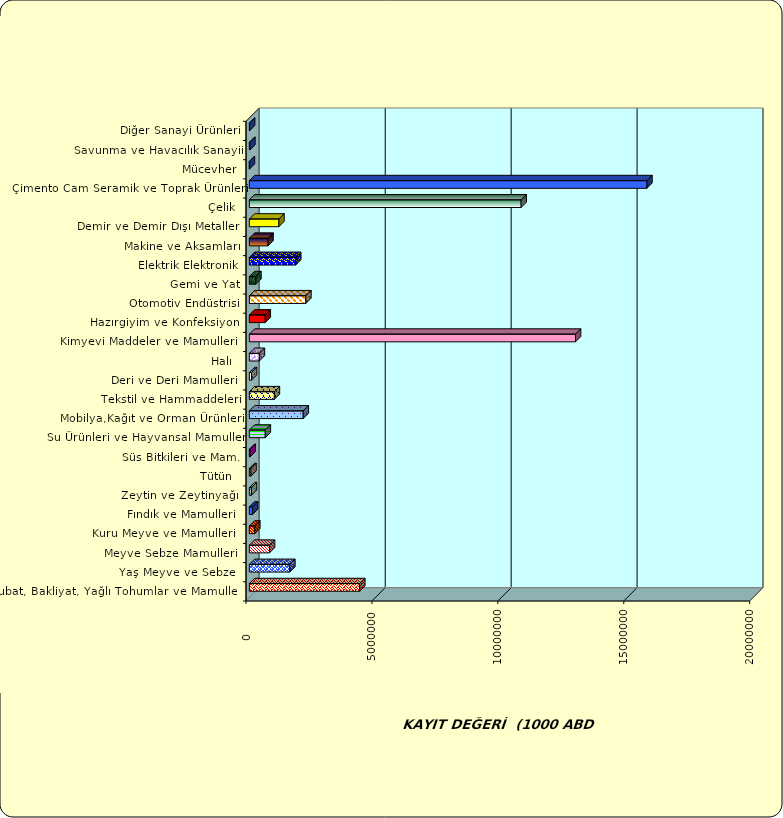
| Category | Series 0 |
|---|---|
|  Hububat, Bakliyat, Yağlı Tohumlar ve Mamulleri  | 4384518.437 |
|  Yaş Meyve ve Sebze   | 1606949.834 |
|  Meyve Sebze Mamulleri  | 801473.786 |
|  Kuru Meyve ve Mamulleri   | 216375.555 |
|  Fındık ve Mamulleri  | 127741.75 |
|  Zeytin ve Zeytinyağı  | 80617.643 |
|  Tütün  | 65295.83 |
|  Süs Bitkileri ve Mam. | 29637.703 |
|  Su Ürünleri ve Hayvansal Mamuller | 632482.756 |
|  Mobilya,Kağıt ve Orman Ürünleri | 2139662.825 |
|  Tekstil ve Hammaddeleri | 993618.462 |
|  Deri ve Deri Mamulleri  | 85947.836 |
|  Halı  | 398601.799 |
|  Kimyevi Maddeler ve Mamulleri   | 12952024.606 |
|  Hazırgiyim ve Konfeksiyon  | 631595.759 |
|  Otomotiv Endüstrisi | 2244278.076 |
|  Gemi ve Yat | 259762.508 |
|  Elektrik Elektronik | 1840525.329 |
|  Makine ve Aksamları | 741435.712 |
|  Demir ve Demir Dışı Metaller  | 1173823.379 |
|  Çelik | 10793174.039 |
|  Çimento Cam Seramik ve Toprak Ürünleri | 15786792.366 |
|  Mücevher | 3044.05 |
|  Savunma ve Havacılık Sanayii | 19777.146 |
|  Diğer Sanayi Ürünleri | 9350.086 |